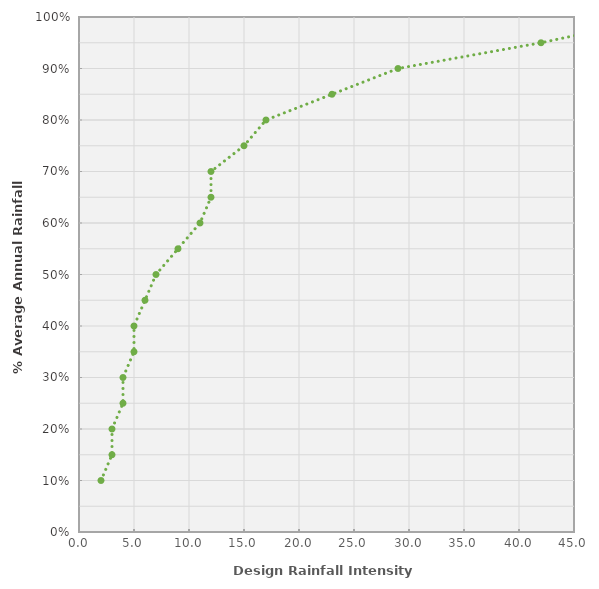
| Category | Cumulative Rainfall |
|---|---|
| 2.0 | 0.1 |
| 3.0 | 0.15 |
| 3.0 | 0.2 |
| 4.0 | 0.25 |
| 4.0 | 0.3 |
| 5.0 | 0.35 |
| 5.0 | 0.4 |
| 6.0 | 0.45 |
| 7.0 | 0.5 |
| 9.0 | 0.55 |
| 11.0 | 0.6 |
| 12.0 | 0.65 |
| 12.0 | 0.7 |
| 15.0 | 0.75 |
| 17.0 | 0.8 |
| 23.0 | 0.85 |
| 29.0 | 0.9 |
| 42.0 | 0.95 |
| 53.0 | 1 |